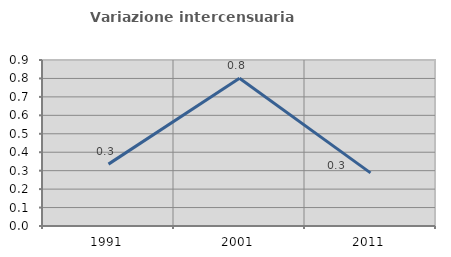
| Category | Variazione intercensuaria annua |
|---|---|
| 1991.0 | 0.335 |
| 2001.0 | 0.801 |
| 2011.0 | 0.288 |